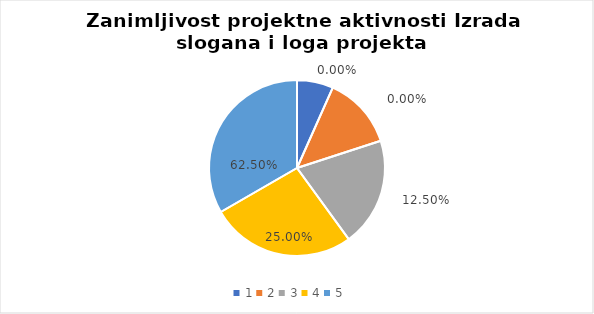
| Category | Series 0 | Series 1 |
|---|---|---|
| 0 | 1 | 0 |
| 1 | 2 | 0 |
| 2 | 3 | 0.125 |
| 3 | 4 | 0.25 |
| 4 | 5 | 0.625 |